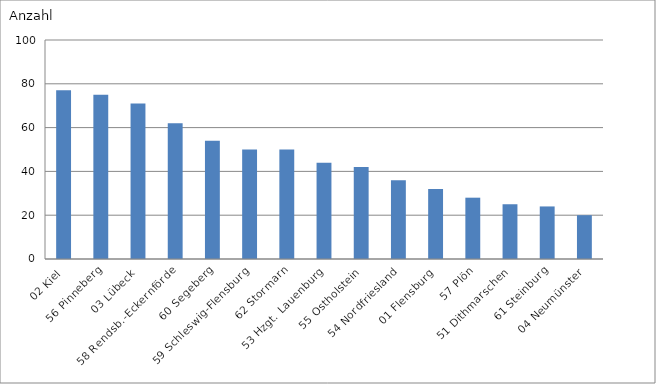
| Category | 02 Kiel |
|---|---|
| 02 Kiel | 77 |
| 56 Pinneberg | 75 |
| 03 Lübeck | 71 |
| 58 Rendsb.-Eckernförde | 62 |
| 60 Segeberg | 54 |
| 59 Schleswig-Flensburg | 50 |
| 62 Stormarn | 50 |
| 53 Hzgt. Lauenburg | 44 |
| 55 Ostholstein | 42 |
| 54 Nordfriesland | 36 |
| 01 Flensburg | 32 |
| 57 Plön | 28 |
| 51 Dithmarschen | 25 |
| 61 Steinburg | 24 |
| 04 Neumünster | 20 |